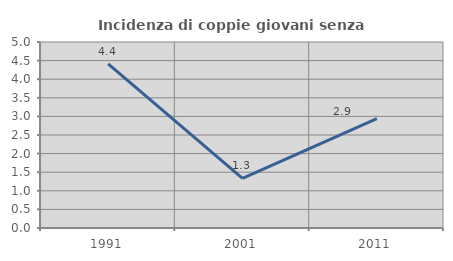
| Category | Incidenza di coppie giovani senza figli |
|---|---|
| 1991.0 | 4.412 |
| 2001.0 | 1.333 |
| 2011.0 | 2.941 |